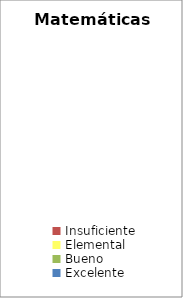
| Category | Matemáticas II |
|---|---|
| Insuficiente | 0 |
| Elemental | 0 |
| Bueno | 0 |
| Excelente | 0 |